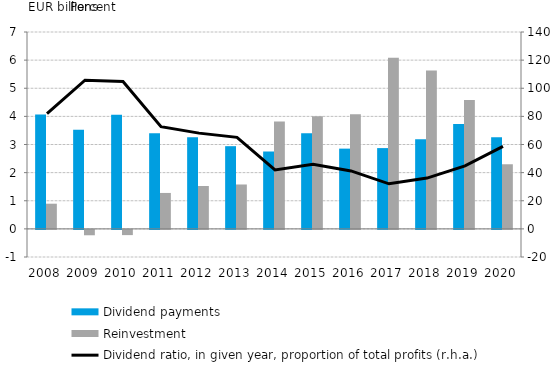
| Category | Dividend payments | Reinvestment |
|---|---|---|
| 2008.0 | 4.064 | 0.895 |
| 2009.0 | 3.522 | -0.192 |
| 2010.0 | 4.061 | -0.186 |
| 2011.0 | 3.399 | 1.278 |
| 2012.0 | 3.253 | 1.525 |
| 2013.0 | 2.94 | 1.578 |
| 2014.0 | 2.751 | 3.816 |
| 2015.0 | 3.396 | 4.002 |
| 2016.0 | 2.853 | 4.073 |
| 2017.0 | 2.872 | 6.088 |
| 2018.0 | 3.188 | 5.635 |
| 2019.0 | 3.729 | 4.586 |
| 2020.0 | 3.258 | 2.298 |